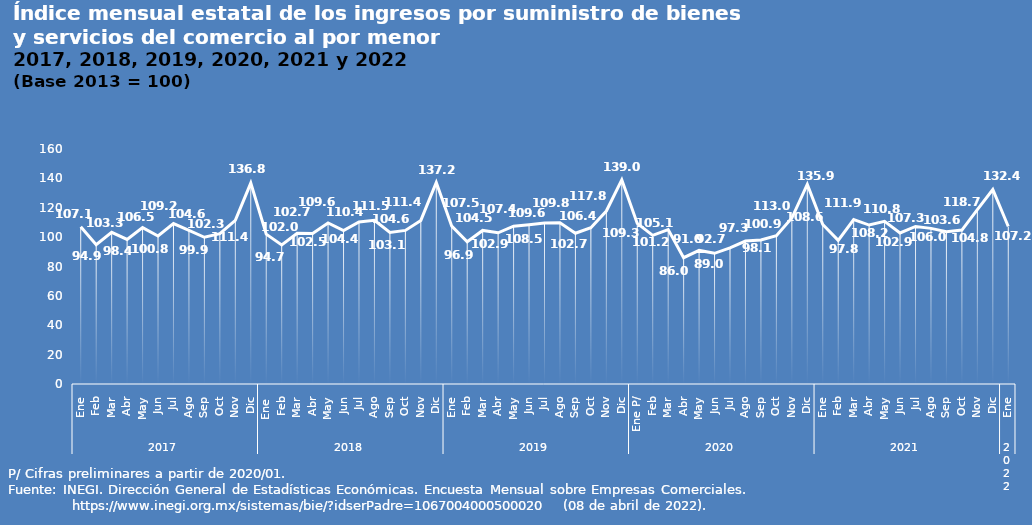
| Category | Series 0 |
|---|---|
| 0 | 107.091 |
| 1 | 94.881 |
| 2 | 103.29 |
| 3 | 98.444 |
| 4 | 106.459 |
| 5 | 100.761 |
| 6 | 109.203 |
| 7 | 104.598 |
| 8 | 99.912 |
| 9 | 102.31 |
| 10 | 111.389 |
| 11 | 136.803 |
| 12 | 102.049 |
| 13 | 94.703 |
| 14 | 102.658 |
| 15 | 102.477 |
| 16 | 109.634 |
| 17 | 104.398 |
| 18 | 110.352 |
| 19 | 111.479 |
| 20 | 103.116 |
| 21 | 104.589 |
| 22 | 111.382 |
| 23 | 137.158 |
| 24 | 107.454 |
| 25 | 96.873 |
| 26 | 104.547 |
| 27 | 102.934 |
| 28 | 107.433 |
| 29 | 108.47 |
| 30 | 109.596 |
| 31 | 109.774 |
| 32 | 102.654 |
| 33 | 106.44 |
| 34 | 117.762 |
| 35 | 139.049 |
| 36 | 109.314 |
| 37 | 101.169 |
| 38 | 105.139 |
| 39 | 85.997 |
| 40 | 90.951 |
| 41 | 88.971 |
| 42 | 92.65 |
| 43 | 97.333 |
| 44 | 98.069 |
| 45 | 100.919 |
| 46 | 113.007 |
| 47 | 135.888 |
| 48 | 108.607 |
| 49 | 97.794 |
| 50 | 111.921 |
| 51 | 108.217 |
| 52 | 110.797 |
| 53 | 102.867 |
| 54 | 107.263 |
| 55 | 105.954 |
| 56 | 103.612 |
| 57 | 104.781 |
| 58 | 118.681 |
| 59 | 132.427 |
| 60 | 107.208 |